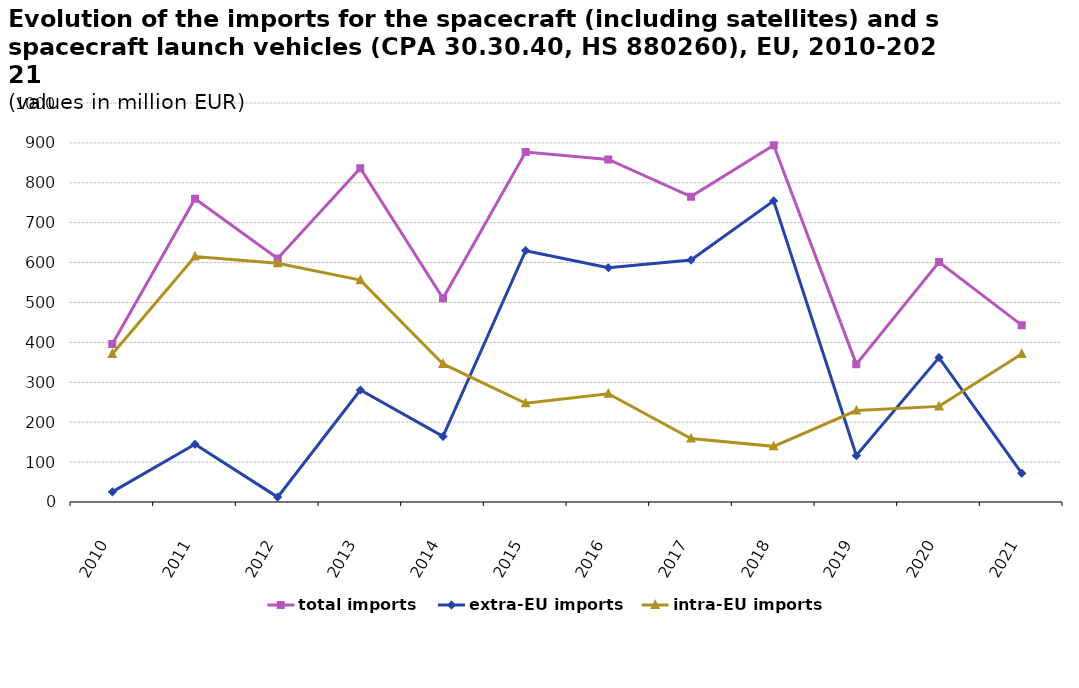
| Category | total imports | extra-EU imports | intra-EU imports |
|---|---|---|---|
| 2010.0 | 396.161 | 25.304 | 370.857 |
| 2011.0 | 760.11 | 144.879 | 615.231 |
| 2012.0 | 610.48 | 12.196 | 598.284 |
| 2013.0 | 836.655 | 280.588 | 556.068 |
| 2014.0 | 510.386 | 164.362 | 346.023 |
| 2015.0 | 877.14 | 629.853 | 247.288 |
| 2016.0 | 858.409 | 587.188 | 271.222 |
| 2017.0 | 765.3 | 606.36 | 158.94 |
| 2018.0 | 894.317 | 754.855 | 139.462 |
| 2019.0 | 345.484 | 116.4 | 229.083 |
| 2020.0 | 601.557 | 361.905 | 239.651 |
| 2021.0 | 443.173 | 72.072 | 371.1 |